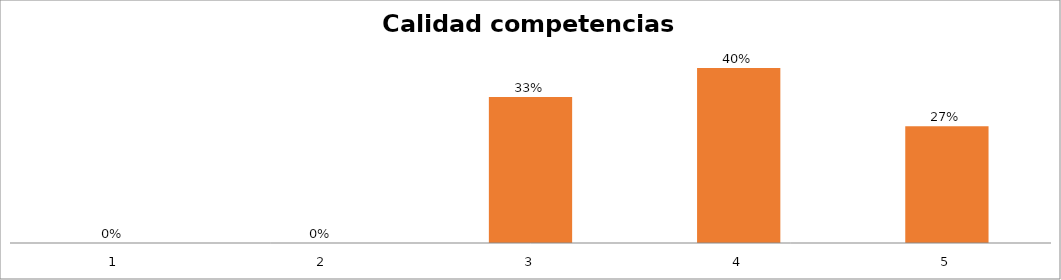
| Category | Series 1 |
|---|---|
| 0 | 0 |
| 1 | 0 |
| 2 | 0.333 |
| 3 | 0.4 |
| 4 | 0.267 |